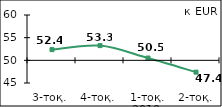
| Category | Диффузиялық индекс* |
|---|---|
| 3-тоқ. | 52.36 |
| 4-тоқ. | 53.25 |
| 1-тоқ. 2010  | 50.505 |
| 2-тоқ. күту | 47.395 |